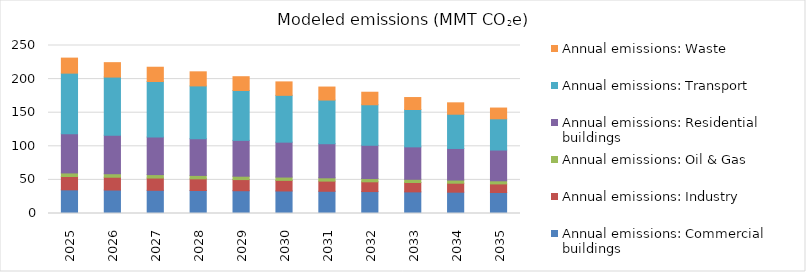
| Category | Annual emissions: Commercial buildings | Annual emissions: Industry | Annual emissions: Oil & Gas | Annual emissions: Residential buildings | Annual emissions: Transport | Annual emissions: Waste |
|---|---|---|---|---|---|---|
| 2025.0 | 35.199 | 19.883 | 5.265 | 58.362 | 90.162 | 22.368 |
| 2026.0 | 34.912 | 19.06 | 5.203 | 57.318 | 86.518 | 21.457 |
| 2027.0 | 34.509 | 18.236 | 5.141 | 55.775 | 82.735 | 21.259 |
| 2028.0 | 34.198 | 17.411 | 5.078 | 54.56 | 78.62 | 20.953 |
| 2029.0 | 33.893 | 16.585 | 5.015 | 53.337 | 74.19 | 20.53 |
| 2030.0 | 33.525 | 15.752 | 4.952 | 51.932 | 69.687 | 19.994 |
| 2031.0 | 33.062 | 15.157 | 4.889 | 50.72 | 64.992 | 19.357 |
| 2032.0 | 32.62 | 14.56 | 4.826 | 49.527 | 60.292 | 18.639 |
| 2033.0 | 32.166 | 13.96 | 4.762 | 48.271 | 55.589 | 17.822 |
| 2034.0 | 31.721 | 13.356 | 4.699 | 47.01 | 50.965 | 16.942 |
| 2035.0 | 31.278 | 12.742 | 4.635 | 45.764 | 46.498 | 16.012 |